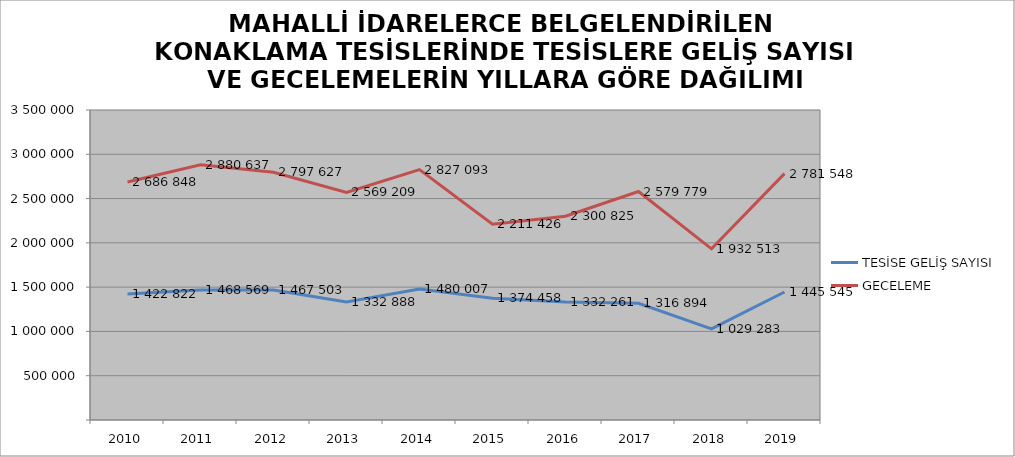
| Category | TESİSE GELİŞ SAYISI | GECELEME |
|---|---|---|
| 2010 | 1422822 | 2686848 |
| 2011 | 1468569 | 2880637 |
| 2012 | 1467503 | 2797627 |
| 2013 | 1332888 | 2569209 |
| 2014 | 1480007 | 2827093 |
| 2015 | 1374458 | 2211426 |
| 2016 | 1332261 | 2300825 |
| 2017 | 1316894 | 2579779 |
| 2018 | 1029283 | 1932513 |
| 2019 | 1445545 | 2781548 |